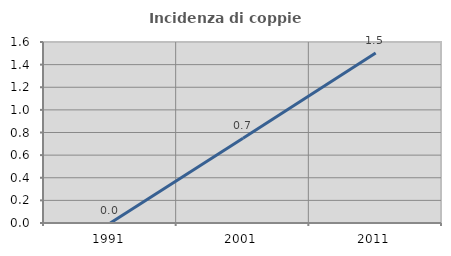
| Category | Incidenza di coppie miste |
|---|---|
| 1991.0 | 0 |
| 2001.0 | 0.749 |
| 2011.0 | 1.504 |